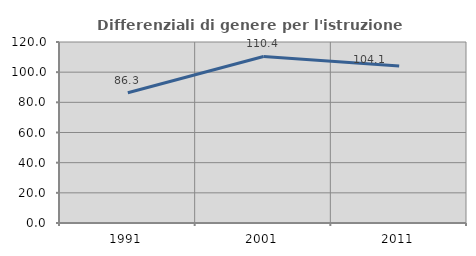
| Category | Differenziali di genere per l'istruzione superiore |
|---|---|
| 1991.0 | 86.344 |
| 2001.0 | 110.388 |
| 2011.0 | 104.078 |